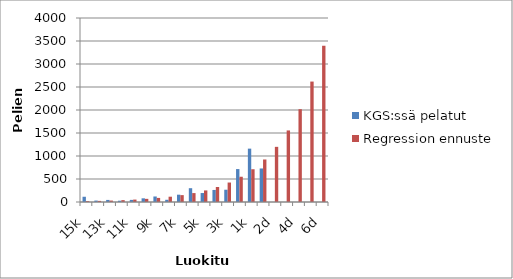
| Category | KGS:ssä pelatut | Regression ennuste |
|---|---|---|
| 15k | 114 | 18.615 |
| 14k | 31 | 24.15 |
| 13k | 45 | 31.331 |
| 12k | 28 | 40.648 |
| 11k | 46 | 52.735 |
| 10k | 80 | 68.416 |
| 9k | 120 | 88.76 |
| 8k | 48 | 115.153 |
| 7k | 159 | 149.395 |
| 6k | 300 | 193.819 |
| 5k | 195 | 251.452 |
| 4k | 262 | 326.223 |
| 3k | 267 | 423.228 |
| 2k | 716 | 549.079 |
| 1k | 1160 | 712.351 |
| 1d | 729 | 924.175 |
| 2d | 0 | 1198.985 |
| 3d | 0 | 1555.513 |
| 4d | 0 | 2018.056 |
| 5d | 0 | 2618.141 |
| 6d | 0 | 3396.665 |